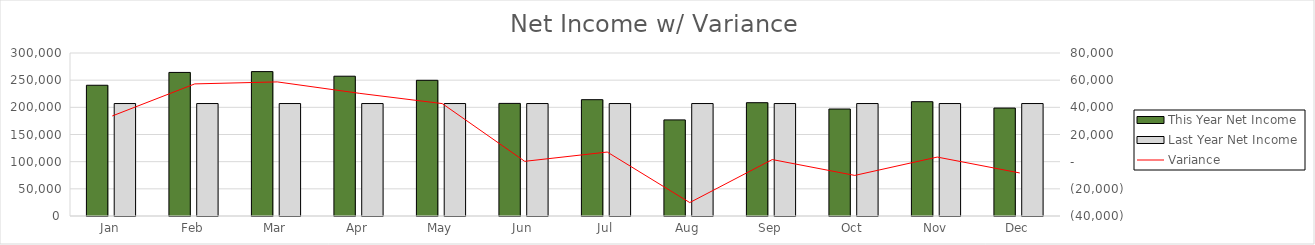
| Category | This Year Net Income | Last Year Net Income |
|---|---|---|
| Jan | 240642.4 | 206994.28 |
| Feb | 264248.4 | 206994.28 |
| Mar | 265722.85 | 206994.28 |
| Apr | 257279.57 | 206994.28 |
| May | 249742.08 | 206994.28 |
| Jun | 207232.41 | 206994.28 |
| Jul | 214087.12 | 206994.28 |
| Aug | 176877.12 | 206994.28 |
| Sep | 208548.12 | 206994.28 |
| Oct | 196877.12 | 206994.28 |
| Nov | 210377.12 | 206994.28 |
| Dec | 198677.12 | 206994.28 |